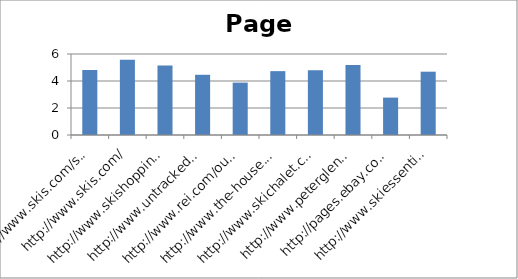
| Category | mozRank |
|---|---|
| http://www.skis.com/ski-equipment/c9/ | 4.82 |
| http://www.skis.com/ | 5.57 |
| http://www.skishoppingguide.com/ | 5.15 |
| http://www.untracked.com/ | 4.46 |
| http://www.rei.com/outlet/category/22000078 | 3.88 |
| http://www.the-house.com/skis.html | 4.73 |
| http://www.skichalet.com/ | 4.79 |
| http://www.peterglenn.com/ | 5.18 |
| http://pages.ebay.com/buy/guides/skis-skiing-equipment-buying-guide/ | 2.77 |
| http://www.skiessentials.com/ | 4.69 |